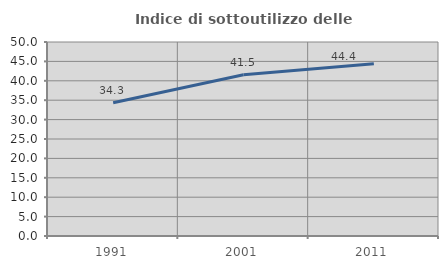
| Category | Indice di sottoutilizzo delle abitazioni  |
|---|---|
| 1991.0 | 34.327 |
| 2001.0 | 41.537 |
| 2011.0 | 44.422 |